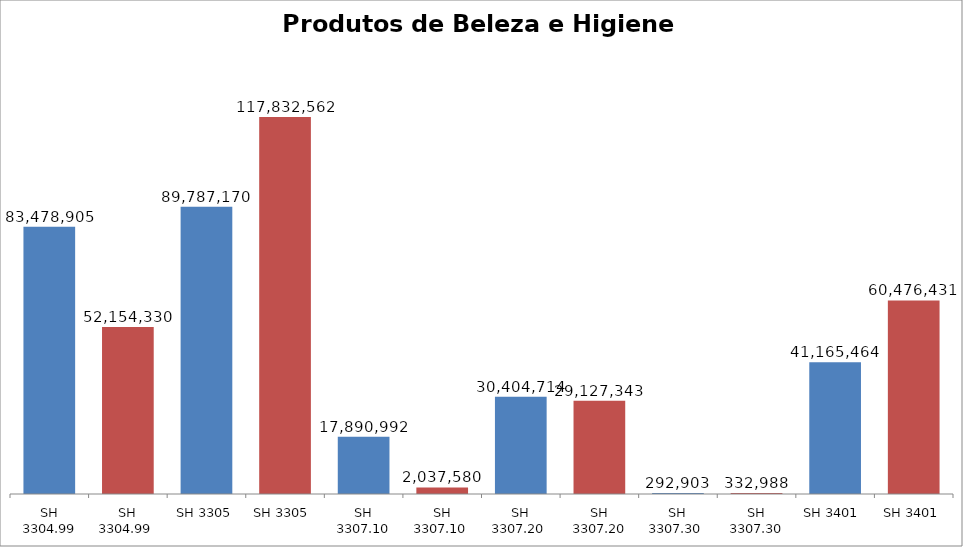
| Category | Total |
|---|---|
| SH 3304.99 | 83478904.58 |
| SH 3304.99  | 52154329.99 |
| SH 3305 | 89787170.03 |
| SH 3305  | 117832561.84 |
| SH 3307.10 | 17890992.32 |
| SH 3307.10  | 2037580.19 |
| SH 3307.20  | 30404714.08 |
| SH 3307.20 | 29127343.06 |
| SH 3307.30  | 292903.25 |
| SH 3307.30 | 332987.92 |
| SH 3401  | 41165464.45 |
| SH 3401 | 60476431.12 |